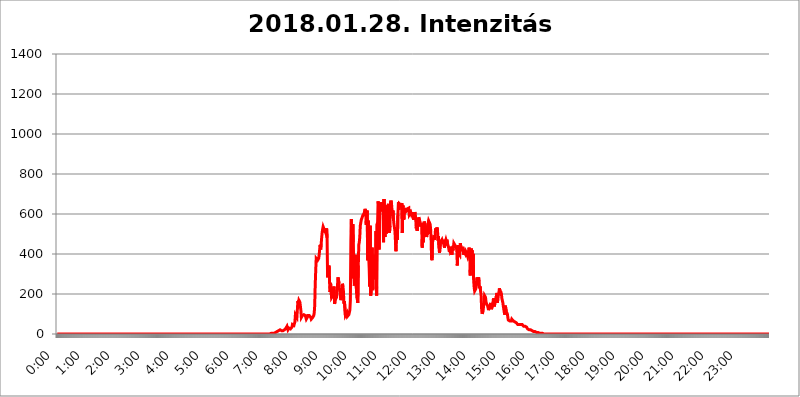
| Category | 2018.01.28. Intenzitás [W/m^2] |
|---|---|
| 0.0 | 0 |
| 0.0006944444444444445 | 0 |
| 0.001388888888888889 | 0 |
| 0.0020833333333333333 | 0 |
| 0.002777777777777778 | 0 |
| 0.003472222222222222 | 0 |
| 0.004166666666666667 | 0 |
| 0.004861111111111111 | 0 |
| 0.005555555555555556 | 0 |
| 0.0062499999999999995 | 0 |
| 0.006944444444444444 | 0 |
| 0.007638888888888889 | 0 |
| 0.008333333333333333 | 0 |
| 0.009027777777777779 | 0 |
| 0.009722222222222222 | 0 |
| 0.010416666666666666 | 0 |
| 0.011111111111111112 | 0 |
| 0.011805555555555555 | 0 |
| 0.012499999999999999 | 0 |
| 0.013194444444444444 | 0 |
| 0.013888888888888888 | 0 |
| 0.014583333333333332 | 0 |
| 0.015277777777777777 | 0 |
| 0.015972222222222224 | 0 |
| 0.016666666666666666 | 0 |
| 0.017361111111111112 | 0 |
| 0.018055555555555557 | 0 |
| 0.01875 | 0 |
| 0.019444444444444445 | 0 |
| 0.02013888888888889 | 0 |
| 0.020833333333333332 | 0 |
| 0.02152777777777778 | 0 |
| 0.022222222222222223 | 0 |
| 0.02291666666666667 | 0 |
| 0.02361111111111111 | 0 |
| 0.024305555555555556 | 0 |
| 0.024999999999999998 | 0 |
| 0.025694444444444447 | 0 |
| 0.02638888888888889 | 0 |
| 0.027083333333333334 | 0 |
| 0.027777777777777776 | 0 |
| 0.02847222222222222 | 0 |
| 0.029166666666666664 | 0 |
| 0.029861111111111113 | 0 |
| 0.030555555555555555 | 0 |
| 0.03125 | 0 |
| 0.03194444444444445 | 0 |
| 0.03263888888888889 | 0 |
| 0.03333333333333333 | 0 |
| 0.034027777777777775 | 0 |
| 0.034722222222222224 | 0 |
| 0.035416666666666666 | 0 |
| 0.036111111111111115 | 0 |
| 0.03680555555555556 | 0 |
| 0.0375 | 0 |
| 0.03819444444444444 | 0 |
| 0.03888888888888889 | 0 |
| 0.03958333333333333 | 0 |
| 0.04027777777777778 | 0 |
| 0.04097222222222222 | 0 |
| 0.041666666666666664 | 0 |
| 0.042361111111111106 | 0 |
| 0.04305555555555556 | 0 |
| 0.043750000000000004 | 0 |
| 0.044444444444444446 | 0 |
| 0.04513888888888889 | 0 |
| 0.04583333333333334 | 0 |
| 0.04652777777777778 | 0 |
| 0.04722222222222222 | 0 |
| 0.04791666666666666 | 0 |
| 0.04861111111111111 | 0 |
| 0.049305555555555554 | 0 |
| 0.049999999999999996 | 0 |
| 0.05069444444444445 | 0 |
| 0.051388888888888894 | 0 |
| 0.052083333333333336 | 0 |
| 0.05277777777777778 | 0 |
| 0.05347222222222222 | 0 |
| 0.05416666666666667 | 0 |
| 0.05486111111111111 | 0 |
| 0.05555555555555555 | 0 |
| 0.05625 | 0 |
| 0.05694444444444444 | 0 |
| 0.057638888888888885 | 0 |
| 0.05833333333333333 | 0 |
| 0.05902777777777778 | 0 |
| 0.059722222222222225 | 0 |
| 0.06041666666666667 | 0 |
| 0.061111111111111116 | 0 |
| 0.06180555555555556 | 0 |
| 0.0625 | 0 |
| 0.06319444444444444 | 0 |
| 0.06388888888888888 | 0 |
| 0.06458333333333334 | 0 |
| 0.06527777777777778 | 0 |
| 0.06597222222222222 | 0 |
| 0.06666666666666667 | 0 |
| 0.06736111111111111 | 0 |
| 0.06805555555555555 | 0 |
| 0.06874999999999999 | 0 |
| 0.06944444444444443 | 0 |
| 0.07013888888888889 | 0 |
| 0.07083333333333333 | 0 |
| 0.07152777777777779 | 0 |
| 0.07222222222222223 | 0 |
| 0.07291666666666667 | 0 |
| 0.07361111111111111 | 0 |
| 0.07430555555555556 | 0 |
| 0.075 | 0 |
| 0.07569444444444444 | 0 |
| 0.0763888888888889 | 0 |
| 0.07708333333333334 | 0 |
| 0.07777777777777778 | 0 |
| 0.07847222222222222 | 0 |
| 0.07916666666666666 | 0 |
| 0.0798611111111111 | 0 |
| 0.08055555555555556 | 0 |
| 0.08125 | 0 |
| 0.08194444444444444 | 0 |
| 0.08263888888888889 | 0 |
| 0.08333333333333333 | 0 |
| 0.08402777777777777 | 0 |
| 0.08472222222222221 | 0 |
| 0.08541666666666665 | 0 |
| 0.08611111111111112 | 0 |
| 0.08680555555555557 | 0 |
| 0.08750000000000001 | 0 |
| 0.08819444444444445 | 0 |
| 0.08888888888888889 | 0 |
| 0.08958333333333333 | 0 |
| 0.09027777777777778 | 0 |
| 0.09097222222222222 | 0 |
| 0.09166666666666667 | 0 |
| 0.09236111111111112 | 0 |
| 0.09305555555555556 | 0 |
| 0.09375 | 0 |
| 0.09444444444444444 | 0 |
| 0.09513888888888888 | 0 |
| 0.09583333333333333 | 0 |
| 0.09652777777777777 | 0 |
| 0.09722222222222222 | 0 |
| 0.09791666666666667 | 0 |
| 0.09861111111111111 | 0 |
| 0.09930555555555555 | 0 |
| 0.09999999999999999 | 0 |
| 0.10069444444444443 | 0 |
| 0.1013888888888889 | 0 |
| 0.10208333333333335 | 0 |
| 0.10277777777777779 | 0 |
| 0.10347222222222223 | 0 |
| 0.10416666666666667 | 0 |
| 0.10486111111111111 | 0 |
| 0.10555555555555556 | 0 |
| 0.10625 | 0 |
| 0.10694444444444444 | 0 |
| 0.1076388888888889 | 0 |
| 0.10833333333333334 | 0 |
| 0.10902777777777778 | 0 |
| 0.10972222222222222 | 0 |
| 0.1111111111111111 | 0 |
| 0.11180555555555556 | 0 |
| 0.11180555555555556 | 0 |
| 0.1125 | 0 |
| 0.11319444444444444 | 0 |
| 0.11388888888888889 | 0 |
| 0.11458333333333333 | 0 |
| 0.11527777777777777 | 0 |
| 0.11597222222222221 | 0 |
| 0.11666666666666665 | 0 |
| 0.1173611111111111 | 0 |
| 0.11805555555555557 | 0 |
| 0.11944444444444445 | 0 |
| 0.12013888888888889 | 0 |
| 0.12083333333333333 | 0 |
| 0.12152777777777778 | 0 |
| 0.12222222222222223 | 0 |
| 0.12291666666666667 | 0 |
| 0.12291666666666667 | 0 |
| 0.12361111111111112 | 0 |
| 0.12430555555555556 | 0 |
| 0.125 | 0 |
| 0.12569444444444444 | 0 |
| 0.12638888888888888 | 0 |
| 0.12708333333333333 | 0 |
| 0.16875 | 0 |
| 0.12847222222222224 | 0 |
| 0.12916666666666668 | 0 |
| 0.12986111111111112 | 0 |
| 0.13055555555555556 | 0 |
| 0.13125 | 0 |
| 0.13194444444444445 | 0 |
| 0.1326388888888889 | 0 |
| 0.13333333333333333 | 0 |
| 0.13402777777777777 | 0 |
| 0.13402777777777777 | 0 |
| 0.13472222222222222 | 0 |
| 0.13541666666666666 | 0 |
| 0.1361111111111111 | 0 |
| 0.13749999999999998 | 0 |
| 0.13819444444444443 | 0 |
| 0.1388888888888889 | 0 |
| 0.13958333333333334 | 0 |
| 0.14027777777777778 | 0 |
| 0.14097222222222222 | 0 |
| 0.14166666666666666 | 0 |
| 0.1423611111111111 | 0 |
| 0.14305555555555557 | 0 |
| 0.14375000000000002 | 0 |
| 0.14444444444444446 | 0 |
| 0.1451388888888889 | 0 |
| 0.1451388888888889 | 0 |
| 0.14652777777777778 | 0 |
| 0.14722222222222223 | 0 |
| 0.14791666666666667 | 0 |
| 0.1486111111111111 | 0 |
| 0.14930555555555555 | 0 |
| 0.15 | 0 |
| 0.15069444444444444 | 0 |
| 0.15138888888888888 | 0 |
| 0.15208333333333332 | 0 |
| 0.15277777777777776 | 0 |
| 0.15347222222222223 | 0 |
| 0.15416666666666667 | 0 |
| 0.15486111111111112 | 0 |
| 0.15555555555555556 | 0 |
| 0.15625 | 0 |
| 0.15694444444444444 | 0 |
| 0.15763888888888888 | 0 |
| 0.15833333333333333 | 0 |
| 0.15902777777777777 | 0 |
| 0.15972222222222224 | 0 |
| 0.16041666666666668 | 0 |
| 0.16111111111111112 | 0 |
| 0.16180555555555556 | 0 |
| 0.1625 | 0 |
| 0.16319444444444445 | 0 |
| 0.1638888888888889 | 0 |
| 0.16458333333333333 | 0 |
| 0.16527777777777777 | 0 |
| 0.16597222222222222 | 0 |
| 0.16666666666666666 | 0 |
| 0.1673611111111111 | 0 |
| 0.16805555555555554 | 0 |
| 0.16874999999999998 | 0 |
| 0.16944444444444443 | 0 |
| 0.17013888888888887 | 0 |
| 0.1708333333333333 | 0 |
| 0.17152777777777775 | 0 |
| 0.17222222222222225 | 0 |
| 0.1729166666666667 | 0 |
| 0.17361111111111113 | 0 |
| 0.17430555555555557 | 0 |
| 0.17500000000000002 | 0 |
| 0.17569444444444446 | 0 |
| 0.1763888888888889 | 0 |
| 0.17708333333333334 | 0 |
| 0.17777777777777778 | 0 |
| 0.17847222222222223 | 0 |
| 0.17916666666666667 | 0 |
| 0.1798611111111111 | 0 |
| 0.18055555555555555 | 0 |
| 0.18125 | 0 |
| 0.18194444444444444 | 0 |
| 0.1826388888888889 | 0 |
| 0.18333333333333335 | 0 |
| 0.1840277777777778 | 0 |
| 0.18472222222222223 | 0 |
| 0.18541666666666667 | 0 |
| 0.18611111111111112 | 0 |
| 0.18680555555555556 | 0 |
| 0.1875 | 0 |
| 0.18819444444444444 | 0 |
| 0.18888888888888888 | 0 |
| 0.18958333333333333 | 0 |
| 0.19027777777777777 | 0 |
| 0.1909722222222222 | 0 |
| 0.19166666666666665 | 0 |
| 0.19236111111111112 | 0 |
| 0.19305555555555554 | 0 |
| 0.19375 | 0 |
| 0.19444444444444445 | 0 |
| 0.1951388888888889 | 0 |
| 0.19583333333333333 | 0 |
| 0.19652777777777777 | 0 |
| 0.19722222222222222 | 0 |
| 0.19791666666666666 | 0 |
| 0.1986111111111111 | 0 |
| 0.19930555555555554 | 0 |
| 0.19999999999999998 | 0 |
| 0.20069444444444443 | 0 |
| 0.20138888888888887 | 0 |
| 0.2020833333333333 | 0 |
| 0.2027777777777778 | 0 |
| 0.2034722222222222 | 0 |
| 0.2041666666666667 | 0 |
| 0.20486111111111113 | 0 |
| 0.20555555555555557 | 0 |
| 0.20625000000000002 | 0 |
| 0.20694444444444446 | 0 |
| 0.2076388888888889 | 0 |
| 0.20833333333333334 | 0 |
| 0.20902777777777778 | 0 |
| 0.20972222222222223 | 0 |
| 0.21041666666666667 | 0 |
| 0.2111111111111111 | 0 |
| 0.21180555555555555 | 0 |
| 0.2125 | 0 |
| 0.21319444444444444 | 0 |
| 0.2138888888888889 | 0 |
| 0.21458333333333335 | 0 |
| 0.2152777777777778 | 0 |
| 0.21597222222222223 | 0 |
| 0.21666666666666667 | 0 |
| 0.21736111111111112 | 0 |
| 0.21805555555555556 | 0 |
| 0.21875 | 0 |
| 0.21944444444444444 | 0 |
| 0.22013888888888888 | 0 |
| 0.22083333333333333 | 0 |
| 0.22152777777777777 | 0 |
| 0.2222222222222222 | 0 |
| 0.22291666666666665 | 0 |
| 0.2236111111111111 | 0 |
| 0.22430555555555556 | 0 |
| 0.225 | 0 |
| 0.22569444444444445 | 0 |
| 0.2263888888888889 | 0 |
| 0.22708333333333333 | 0 |
| 0.22777777777777777 | 0 |
| 0.22847222222222222 | 0 |
| 0.22916666666666666 | 0 |
| 0.2298611111111111 | 0 |
| 0.23055555555555554 | 0 |
| 0.23124999999999998 | 0 |
| 0.23194444444444443 | 0 |
| 0.23263888888888887 | 0 |
| 0.2333333333333333 | 0 |
| 0.2340277777777778 | 0 |
| 0.2347222222222222 | 0 |
| 0.2354166666666667 | 0 |
| 0.23611111111111113 | 0 |
| 0.23680555555555557 | 0 |
| 0.23750000000000002 | 0 |
| 0.23819444444444446 | 0 |
| 0.2388888888888889 | 0 |
| 0.23958333333333334 | 0 |
| 0.24027777777777778 | 0 |
| 0.24097222222222223 | 0 |
| 0.24166666666666667 | 0 |
| 0.2423611111111111 | 0 |
| 0.24305555555555555 | 0 |
| 0.24375 | 0 |
| 0.24444444444444446 | 0 |
| 0.24513888888888888 | 0 |
| 0.24583333333333335 | 0 |
| 0.2465277777777778 | 0 |
| 0.24722222222222223 | 0 |
| 0.24791666666666667 | 0 |
| 0.24861111111111112 | 0 |
| 0.24930555555555556 | 0 |
| 0.25 | 0 |
| 0.25069444444444444 | 0 |
| 0.2513888888888889 | 0 |
| 0.2520833333333333 | 0 |
| 0.25277777777777777 | 0 |
| 0.2534722222222222 | 0 |
| 0.25416666666666665 | 0 |
| 0.2548611111111111 | 0 |
| 0.2555555555555556 | 0 |
| 0.25625000000000003 | 0 |
| 0.2569444444444445 | 0 |
| 0.2576388888888889 | 0 |
| 0.25833333333333336 | 0 |
| 0.2590277777777778 | 0 |
| 0.25972222222222224 | 0 |
| 0.2604166666666667 | 0 |
| 0.2611111111111111 | 0 |
| 0.26180555555555557 | 0 |
| 0.2625 | 0 |
| 0.26319444444444445 | 0 |
| 0.2638888888888889 | 0 |
| 0.26458333333333334 | 0 |
| 0.2652777777777778 | 0 |
| 0.2659722222222222 | 0 |
| 0.26666666666666666 | 0 |
| 0.2673611111111111 | 0 |
| 0.26805555555555555 | 0 |
| 0.26875 | 0 |
| 0.26944444444444443 | 0 |
| 0.2701388888888889 | 0 |
| 0.2708333333333333 | 0 |
| 0.27152777777777776 | 0 |
| 0.2722222222222222 | 0 |
| 0.27291666666666664 | 0 |
| 0.2736111111111111 | 0 |
| 0.2743055555555555 | 0 |
| 0.27499999999999997 | 0 |
| 0.27569444444444446 | 0 |
| 0.27638888888888885 | 0 |
| 0.27708333333333335 | 0 |
| 0.2777777777777778 | 0 |
| 0.27847222222222223 | 0 |
| 0.2791666666666667 | 0 |
| 0.2798611111111111 | 0 |
| 0.28055555555555556 | 0 |
| 0.28125 | 0 |
| 0.28194444444444444 | 0 |
| 0.2826388888888889 | 0 |
| 0.2833333333333333 | 0 |
| 0.28402777777777777 | 0 |
| 0.2847222222222222 | 0 |
| 0.28541666666666665 | 0 |
| 0.28611111111111115 | 0 |
| 0.28680555555555554 | 0 |
| 0.28750000000000003 | 0 |
| 0.2881944444444445 | 0 |
| 0.2888888888888889 | 0 |
| 0.28958333333333336 | 0 |
| 0.2902777777777778 | 0 |
| 0.29097222222222224 | 0 |
| 0.2916666666666667 | 0 |
| 0.2923611111111111 | 0 |
| 0.29305555555555557 | 0 |
| 0.29375 | 0 |
| 0.29444444444444445 | 0 |
| 0.2951388888888889 | 0 |
| 0.29583333333333334 | 0 |
| 0.2965277777777778 | 0 |
| 0.2972222222222222 | 0 |
| 0.29791666666666666 | 0 |
| 0.2986111111111111 | 0 |
| 0.29930555555555555 | 3.525 |
| 0.3 | 3.525 |
| 0.30069444444444443 | 3.525 |
| 0.3013888888888889 | 3.525 |
| 0.3020833333333333 | 3.525 |
| 0.30277777777777776 | 3.525 |
| 0.3034722222222222 | 3.525 |
| 0.30416666666666664 | 3.525 |
| 0.3048611111111111 | 7.887 |
| 0.3055555555555555 | 7.887 |
| 0.30624999999999997 | 7.887 |
| 0.3069444444444444 | 12.257 |
| 0.3076388888888889 | 12.257 |
| 0.30833333333333335 | 12.257 |
| 0.3090277777777778 | 12.257 |
| 0.30972222222222223 | 16.636 |
| 0.3104166666666667 | 16.636 |
| 0.3111111111111111 | 16.636 |
| 0.31180555555555556 | 21.024 |
| 0.3125 | 21.024 |
| 0.31319444444444444 | 21.024 |
| 0.3138888888888889 | 21.024 |
| 0.3145833333333333 | 16.636 |
| 0.31527777777777777 | 16.636 |
| 0.3159722222222222 | 16.636 |
| 0.31666666666666665 | 16.636 |
| 0.31736111111111115 | 21.024 |
| 0.31805555555555554 | 21.024 |
| 0.31875000000000003 | 21.024 |
| 0.3194444444444445 | 21.024 |
| 0.3201388888888889 | 21.024 |
| 0.32083333333333336 | 29.823 |
| 0.3215277777777778 | 34.234 |
| 0.32222222222222224 | 38.653 |
| 0.3229166666666667 | 29.823 |
| 0.3236111111111111 | 21.024 |
| 0.32430555555555557 | 21.024 |
| 0.325 | 29.823 |
| 0.32569444444444445 | 29.823 |
| 0.3263888888888889 | 25.419 |
| 0.32708333333333334 | 25.419 |
| 0.3277777777777778 | 25.419 |
| 0.3284722222222222 | 29.823 |
| 0.32916666666666666 | 34.234 |
| 0.3298611111111111 | 47.511 |
| 0.33055555555555555 | 47.511 |
| 0.33125 | 43.079 |
| 0.33194444444444443 | 43.079 |
| 0.3326388888888889 | 47.511 |
| 0.3333333333333333 | 60.85 |
| 0.3340277777777778 | 96.682 |
| 0.3347222222222222 | 101.184 |
| 0.3354166666666667 | 96.682 |
| 0.3361111111111111 | 83.205 |
| 0.3368055555555556 | 123.758 |
| 0.33749999999999997 | 164.605 |
| 0.33819444444444446 | 155.509 |
| 0.33888888888888885 | 169.156 |
| 0.33958333333333335 | 173.709 |
| 0.34027777777777773 | 160.056 |
| 0.34097222222222223 | 160.056 |
| 0.3416666666666666 | 119.235 |
| 0.3423611111111111 | 83.205 |
| 0.3430555555555555 | 83.205 |
| 0.34375 | 92.184 |
| 0.3444444444444445 | 96.682 |
| 0.3451388888888889 | 96.682 |
| 0.3458333333333334 | 96.682 |
| 0.34652777777777777 | 101.184 |
| 0.34722222222222227 | 101.184 |
| 0.34791666666666665 | 92.184 |
| 0.34861111111111115 | 83.205 |
| 0.34930555555555554 | 74.246 |
| 0.35000000000000003 | 78.722 |
| 0.3506944444444444 | 83.205 |
| 0.3513888888888889 | 92.184 |
| 0.3520833333333333 | 92.184 |
| 0.3527777777777778 | 92.184 |
| 0.3534722222222222 | 92.184 |
| 0.3541666666666667 | 92.184 |
| 0.3548611111111111 | 87.692 |
| 0.35555555555555557 | 83.205 |
| 0.35625 | 74.246 |
| 0.35694444444444445 | 78.722 |
| 0.3576388888888889 | 78.722 |
| 0.35833333333333334 | 83.205 |
| 0.3590277777777778 | 83.205 |
| 0.3597222222222222 | 92.184 |
| 0.36041666666666666 | 105.69 |
| 0.3611111111111111 | 141.884 |
| 0.36180555555555555 | 246.689 |
| 0.3625 | 314.98 |
| 0.36319444444444443 | 378.224 |
| 0.3638888888888889 | 382.715 |
| 0.3645833333333333 | 382.715 |
| 0.3652777777777778 | 369.23 |
| 0.3659722222222222 | 364.728 |
| 0.3666666666666667 | 378.224 |
| 0.3673611111111111 | 396.164 |
| 0.3680555555555556 | 422.943 |
| 0.36874999999999997 | 445.129 |
| 0.36944444444444446 | 422.943 |
| 0.37013888888888885 | 449.551 |
| 0.37083333333333335 | 480.356 |
| 0.37152777777777773 | 506.542 |
| 0.37222222222222223 | 523.88 |
| 0.3729166666666666 | 536.82 |
| 0.3736111111111111 | 532.513 |
| 0.3743055555555555 | 523.88 |
| 0.375 | 523.88 |
| 0.3756944444444445 | 523.88 |
| 0.3763888888888889 | 506.542 |
| 0.3770833333333334 | 519.555 |
| 0.37777777777777777 | 528.2 |
| 0.37847222222222227 | 480.356 |
| 0.37916666666666665 | 283.156 |
| 0.37986111111111115 | 310.44 |
| 0.38055555555555554 | 314.98 |
| 0.38125000000000003 | 342.162 |
| 0.3819444444444444 | 255.813 |
| 0.3826388888888889 | 210.182 |
| 0.3833333333333333 | 255.813 |
| 0.3840277777777778 | 251.251 |
| 0.3847222222222222 | 182.82 |
| 0.3854166666666667 | 182.82 |
| 0.3861111111111111 | 187.378 |
| 0.38680555555555557 | 196.497 |
| 0.3875 | 219.309 |
| 0.38819444444444445 | 237.564 |
| 0.3888888888888889 | 150.964 |
| 0.38958333333333334 | 160.056 |
| 0.3902777777777778 | 173.709 |
| 0.3909722222222222 | 178.264 |
| 0.39166666666666666 | 182.82 |
| 0.3923611111111111 | 219.309 |
| 0.39305555555555555 | 242.127 |
| 0.39375 | 283.156 |
| 0.39444444444444443 | 278.603 |
| 0.3951388888888889 | 255.813 |
| 0.3958333333333333 | 223.873 |
| 0.3965277777777778 | 210.182 |
| 0.3972222222222222 | 182.82 |
| 0.3979166666666667 | 169.156 |
| 0.3986111111111111 | 169.156 |
| 0.3993055555555556 | 196.497 |
| 0.39999999999999997 | 251.251 |
| 0.40069444444444446 | 237.564 |
| 0.40138888888888885 | 214.746 |
| 0.40208333333333335 | 150.964 |
| 0.40277777777777773 | 164.605 |
| 0.40347222222222223 | 160.056 |
| 0.4041666666666666 | 92.184 |
| 0.4048611111111111 | 87.692 |
| 0.4055555555555555 | 92.184 |
| 0.40625 | 105.69 |
| 0.4069444444444445 | 87.692 |
| 0.4076388888888889 | 87.692 |
| 0.4083333333333334 | 92.184 |
| 0.40902777777777777 | 96.682 |
| 0.40972222222222227 | 101.184 |
| 0.41041666666666665 | 119.235 |
| 0.41111111111111115 | 169.156 |
| 0.41180555555555554 | 467.187 |
| 0.41250000000000003 | 575.299 |
| 0.4131944444444444 | 278.603 |
| 0.4138888888888889 | 480.356 |
| 0.4145833333333333 | 549.704 |
| 0.4152777777777778 | 458.38 |
| 0.4159722222222222 | 305.898 |
| 0.4166666666666667 | 242.127 |
| 0.4173611111111111 | 260.373 |
| 0.41805555555555557 | 396.164 |
| 0.41875 | 396.164 |
| 0.41944444444444445 | 233 |
| 0.4201388888888889 | 182.82 |
| 0.42083333333333334 | 173.709 |
| 0.4215277777777778 | 155.509 |
| 0.4222222222222222 | 342.162 |
| 0.42291666666666666 | 445.129 |
| 0.4236111111111111 | 458.38 |
| 0.42430555555555555 | 484.735 |
| 0.425 | 541.121 |
| 0.42569444444444443 | 541.121 |
| 0.4263888888888889 | 571.049 |
| 0.4270833333333333 | 575.299 |
| 0.4277777777777778 | 583.779 |
| 0.4284722222222222 | 592.233 |
| 0.4291666666666667 | 588.009 |
| 0.4298611111111111 | 600.661 |
| 0.4305555555555556 | 592.233 |
| 0.43124999999999997 | 617.436 |
| 0.43194444444444446 | 625.784 |
| 0.43263888888888885 | 604.864 |
| 0.43333333333333335 | 545.416 |
| 0.43402777777777773 | 600.661 |
| 0.43472222222222223 | 617.436 |
| 0.4354166666666666 | 369.23 |
| 0.4361111111111111 | 566.793 |
| 0.4368055555555555 | 387.202 |
| 0.4375 | 328.584 |
| 0.4381944444444445 | 237.564 |
| 0.4388888888888889 | 541.121 |
| 0.4395833333333334 | 191.937 |
| 0.44027777777777777 | 219.309 |
| 0.44097222222222227 | 355.712 |
| 0.44166666666666665 | 431.833 |
| 0.44236111111111115 | 219.309 |
| 0.44305555555555554 | 233 |
| 0.44375000000000003 | 378.224 |
| 0.4444444444444444 | 274.047 |
| 0.4451388888888889 | 396.164 |
| 0.4458333333333333 | 387.202 |
| 0.4465277777777778 | 292.259 |
| 0.4472222222222222 | 515.223 |
| 0.4479166666666667 | 191.937 |
| 0.4486111111111111 | 549.704 |
| 0.44930555555555557 | 558.261 |
| 0.45 | 663.019 |
| 0.45069444444444445 | 646.537 |
| 0.4513888888888889 | 422.943 |
| 0.45208333333333334 | 588.009 |
| 0.4527777777777778 | 658.909 |
| 0.4534722222222222 | 634.105 |
| 0.45416666666666666 | 629.948 |
| 0.4548611111111111 | 613.252 |
| 0.45555555555555555 | 638.256 |
| 0.45625 | 658.909 |
| 0.45694444444444443 | 613.252 |
| 0.4576388888888889 | 458.38 |
| 0.4583333333333333 | 675.311 |
| 0.4590277777777778 | 583.779 |
| 0.4597222222222222 | 484.735 |
| 0.4604166666666667 | 642.4 |
| 0.4611111111111111 | 613.252 |
| 0.4618055555555556 | 502.192 |
| 0.46249999999999997 | 571.049 |
| 0.46319444444444446 | 638.256 |
| 0.46388888888888885 | 638.256 |
| 0.46458333333333335 | 650.667 |
| 0.46527777777777773 | 566.793 |
| 0.46597222222222223 | 506.542 |
| 0.4666666666666666 | 541.121 |
| 0.4673611111111111 | 658.909 |
| 0.4680555555555555 | 667.123 |
| 0.46875 | 654.791 |
| 0.4694444444444445 | 658.909 |
| 0.4701388888888889 | 592.233 |
| 0.4708333333333334 | 617.436 |
| 0.47152777777777777 | 575.299 |
| 0.47222222222222227 | 549.704 |
| 0.47291666666666665 | 549.704 |
| 0.47361111111111115 | 515.223 |
| 0.47430555555555554 | 467.187 |
| 0.47500000000000003 | 414.035 |
| 0.4756944444444444 | 506.542 |
| 0.4763888888888889 | 502.192 |
| 0.4770833333333333 | 471.582 |
| 0.4777777777777778 | 596.45 |
| 0.4784722222222222 | 658.909 |
| 0.4791666666666667 | 621.613 |
| 0.4798611111111111 | 650.667 |
| 0.48055555555555557 | 654.791 |
| 0.48125 | 650.667 |
| 0.48194444444444445 | 642.4 |
| 0.4826388888888889 | 646.537 |
| 0.48333333333333334 | 654.791 |
| 0.4840277777777778 | 506.542 |
| 0.4847222222222222 | 642.4 |
| 0.48541666666666666 | 634.105 |
| 0.4861111111111111 | 571.049 |
| 0.48680555555555555 | 629.948 |
| 0.4875 | 621.613 |
| 0.48819444444444443 | 609.062 |
| 0.4888888888888889 | 604.864 |
| 0.4895833333333333 | 613.252 |
| 0.4902777777777778 | 617.436 |
| 0.4909722222222222 | 625.784 |
| 0.4916666666666667 | 621.613 |
| 0.4923611111111111 | 621.613 |
| 0.4930555555555556 | 629.948 |
| 0.49374999999999997 | 596.45 |
| 0.49444444444444446 | 596.45 |
| 0.49513888888888885 | 600.661 |
| 0.49583333333333335 | 609.062 |
| 0.49652777777777773 | 600.661 |
| 0.49722222222222223 | 609.062 |
| 0.4979166666666666 | 596.45 |
| 0.4986111111111111 | 609.062 |
| 0.4993055555555555 | 609.062 |
| 0.5 | 571.049 |
| 0.5006944444444444 | 571.049 |
| 0.5013888888888889 | 609.062 |
| 0.5020833333333333 | 600.661 |
| 0.5027777777777778 | 575.299 |
| 0.5034722222222222 | 528.2 |
| 0.5041666666666667 | 545.416 |
| 0.5048611111111111 | 515.223 |
| 0.5055555555555555 | 545.416 |
| 0.50625 | 558.261 |
| 0.5069444444444444 | 583.779 |
| 0.5076388888888889 | 579.542 |
| 0.5083333333333333 | 566.793 |
| 0.5090277777777777 | 558.261 |
| 0.5097222222222222 | 536.82 |
| 0.5104166666666666 | 553.986 |
| 0.5111111111111112 | 545.416 |
| 0.5118055555555555 | 431.833 |
| 0.5125000000000001 | 528.2 |
| 0.5131944444444444 | 458.38 |
| 0.513888888888889 | 523.88 |
| 0.5145833333333333 | 562.53 |
| 0.5152777777777778 | 558.261 |
| 0.5159722222222222 | 558.261 |
| 0.5166666666666667 | 532.513 |
| 0.517361111111111 | 536.82 |
| 0.5180555555555556 | 484.735 |
| 0.5187499999999999 | 506.542 |
| 0.5194444444444445 | 497.836 |
| 0.5201388888888888 | 553.986 |
| 0.5208333333333334 | 566.793 |
| 0.5215277777777778 | 566.793 |
| 0.5222222222222223 | 562.53 |
| 0.5229166666666667 | 549.704 |
| 0.5236111111111111 | 528.2 |
| 0.5243055555555556 | 480.356 |
| 0.525 | 378.224 |
| 0.5256944444444445 | 369.23 |
| 0.5263888888888889 | 458.38 |
| 0.5270833333333333 | 471.582 |
| 0.5277777777777778 | 480.356 |
| 0.5284722222222222 | 493.475 |
| 0.5291666666666667 | 471.582 |
| 0.5298611111111111 | 484.735 |
| 0.5305555555555556 | 528.2 |
| 0.53125 | 528.2 |
| 0.5319444444444444 | 515.223 |
| 0.5326388888888889 | 532.513 |
| 0.5333333333333333 | 519.555 |
| 0.5340277777777778 | 467.187 |
| 0.5347222222222222 | 489.108 |
| 0.5354166666666667 | 431.833 |
| 0.5361111111111111 | 405.108 |
| 0.5368055555555555 | 400.638 |
| 0.5375 | 458.38 |
| 0.5381944444444444 | 453.968 |
| 0.5388888888888889 | 458.38 |
| 0.5395833333333333 | 471.582 |
| 0.5402777777777777 | 462.786 |
| 0.5409722222222222 | 458.38 |
| 0.5416666666666666 | 453.968 |
| 0.5423611111111112 | 471.582 |
| 0.5430555555555555 | 431.833 |
| 0.5437500000000001 | 453.968 |
| 0.5444444444444444 | 453.968 |
| 0.545138888888889 | 471.582 |
| 0.5458333333333333 | 462.786 |
| 0.5465277777777778 | 471.582 |
| 0.5472222222222222 | 453.968 |
| 0.5479166666666667 | 449.551 |
| 0.548611111111111 | 436.27 |
| 0.5493055555555556 | 436.27 |
| 0.5499999999999999 | 409.574 |
| 0.5506944444444445 | 436.27 |
| 0.5513888888888888 | 414.035 |
| 0.5520833333333334 | 414.035 |
| 0.5527777777777778 | 422.943 |
| 0.5534722222222223 | 396.164 |
| 0.5541666666666667 | 431.833 |
| 0.5548611111111111 | 418.492 |
| 0.5555555555555556 | 427.39 |
| 0.55625 | 453.968 |
| 0.5569444444444445 | 449.551 |
| 0.5576388888888889 | 458.38 |
| 0.5583333333333333 | 440.702 |
| 0.5590277777777778 | 445.129 |
| 0.5597222222222222 | 431.833 |
| 0.5604166666666667 | 418.492 |
| 0.5611111111111111 | 342.162 |
| 0.5618055555555556 | 409.574 |
| 0.5625 | 445.129 |
| 0.5631944444444444 | 405.108 |
| 0.5638888888888889 | 405.108 |
| 0.5645833333333333 | 396.164 |
| 0.5652777777777778 | 453.968 |
| 0.5659722222222222 | 440.702 |
| 0.5666666666666667 | 436.27 |
| 0.5673611111111111 | 414.035 |
| 0.5680555555555555 | 427.39 |
| 0.56875 | 436.27 |
| 0.5694444444444444 | 414.035 |
| 0.5701388888888889 | 396.164 |
| 0.5708333333333333 | 409.574 |
| 0.5715277777777777 | 409.574 |
| 0.5722222222222222 | 400.638 |
| 0.5729166666666666 | 414.035 |
| 0.5736111111111112 | 414.035 |
| 0.5743055555555555 | 405.108 |
| 0.5750000000000001 | 405.108 |
| 0.5756944444444444 | 387.202 |
| 0.576388888888889 | 396.164 |
| 0.5770833333333333 | 422.943 |
| 0.5777777777777778 | 431.833 |
| 0.5784722222222222 | 409.574 |
| 0.5791666666666667 | 292.259 |
| 0.579861111111111 | 369.23 |
| 0.5805555555555556 | 427.39 |
| 0.5812499999999999 | 409.574 |
| 0.5819444444444445 | 418.492 |
| 0.5826388888888888 | 346.682 |
| 0.5833333333333334 | 400.638 |
| 0.5840277777777778 | 269.49 |
| 0.5847222222222223 | 233 |
| 0.5854166666666667 | 214.746 |
| 0.5861111111111111 | 214.746 |
| 0.5868055555555556 | 223.873 |
| 0.5875 | 233 |
| 0.5881944444444445 | 251.251 |
| 0.5888888888888889 | 283.156 |
| 0.5895833333333333 | 260.373 |
| 0.5902777777777778 | 269.49 |
| 0.5909722222222222 | 283.156 |
| 0.5916666666666667 | 260.373 |
| 0.5923611111111111 | 228.436 |
| 0.5930555555555556 | 237.564 |
| 0.59375 | 214.746 |
| 0.5944444444444444 | 196.497 |
| 0.5951388888888889 | 128.284 |
| 0.5958333333333333 | 101.184 |
| 0.5965277777777778 | 101.184 |
| 0.5972222222222222 | 114.716 |
| 0.5979166666666667 | 137.347 |
| 0.5986111111111111 | 160.056 |
| 0.5993055555555555 | 191.937 |
| 0.6 | 191.937 |
| 0.6006944444444444 | 182.82 |
| 0.6013888888888889 | 160.056 |
| 0.6020833333333333 | 150.964 |
| 0.6027777777777777 | 146.423 |
| 0.6034722222222222 | 141.884 |
| 0.6041666666666666 | 132.814 |
| 0.6048611111111112 | 119.235 |
| 0.6055555555555555 | 119.235 |
| 0.6062500000000001 | 141.884 |
| 0.6069444444444444 | 128.284 |
| 0.607638888888889 | 155.509 |
| 0.6083333333333333 | 132.814 |
| 0.6090277777777778 | 123.758 |
| 0.6097222222222222 | 119.235 |
| 0.6104166666666667 | 119.235 |
| 0.611111111111111 | 155.509 |
| 0.6118055555555556 | 178.264 |
| 0.6124999999999999 | 146.423 |
| 0.6131944444444445 | 137.347 |
| 0.6138888888888888 | 164.605 |
| 0.6145833333333334 | 155.509 |
| 0.6152777777777778 | 155.509 |
| 0.6159722222222223 | 191.937 |
| 0.6166666666666667 | 205.62 |
| 0.6173611111111111 | 155.509 |
| 0.6180555555555556 | 182.82 |
| 0.61875 | 178.264 |
| 0.6194444444444445 | 205.62 |
| 0.6201388888888889 | 228.436 |
| 0.6208333333333333 | 219.309 |
| 0.6215277777777778 | 219.309 |
| 0.6222222222222222 | 210.182 |
| 0.6229166666666667 | 201.058 |
| 0.6236111111111111 | 178.264 |
| 0.6243055555555556 | 182.82 |
| 0.625 | 155.509 |
| 0.6256944444444444 | 137.347 |
| 0.6263888888888889 | 137.347 |
| 0.6270833333333333 | 105.69 |
| 0.6277777777777778 | 96.682 |
| 0.6284722222222222 | 141.884 |
| 0.6291666666666667 | 137.347 |
| 0.6298611111111111 | 110.201 |
| 0.6305555555555555 | 105.69 |
| 0.63125 | 101.184 |
| 0.6319444444444444 | 83.205 |
| 0.6326388888888889 | 69.775 |
| 0.6333333333333333 | 65.31 |
| 0.6340277777777777 | 65.31 |
| 0.6347222222222222 | 65.31 |
| 0.6354166666666666 | 60.85 |
| 0.6361111111111112 | 65.31 |
| 0.6368055555555555 | 65.31 |
| 0.6375000000000001 | 74.246 |
| 0.6381944444444444 | 78.722 |
| 0.638888888888889 | 74.246 |
| 0.6395833333333333 | 65.31 |
| 0.6402777777777778 | 65.31 |
| 0.6409722222222222 | 65.31 |
| 0.6416666666666667 | 60.85 |
| 0.642361111111111 | 60.85 |
| 0.6430555555555556 | 56.398 |
| 0.6437499999999999 | 56.398 |
| 0.6444444444444445 | 51.951 |
| 0.6451388888888888 | 51.951 |
| 0.6458333333333334 | 47.511 |
| 0.6465277777777778 | 47.511 |
| 0.6472222222222223 | 47.511 |
| 0.6479166666666667 | 47.511 |
| 0.6486111111111111 | 47.511 |
| 0.6493055555555556 | 47.511 |
| 0.65 | 47.511 |
| 0.6506944444444445 | 51.951 |
| 0.6513888888888889 | 47.511 |
| 0.6520833333333333 | 47.511 |
| 0.6527777777777778 | 47.511 |
| 0.6534722222222222 | 47.511 |
| 0.6541666666666667 | 38.653 |
| 0.6548611111111111 | 43.079 |
| 0.6555555555555556 | 43.079 |
| 0.65625 | 38.653 |
| 0.6569444444444444 | 38.653 |
| 0.6576388888888889 | 34.234 |
| 0.6583333333333333 | 34.234 |
| 0.6590277777777778 | 29.823 |
| 0.6597222222222222 | 25.419 |
| 0.6604166666666667 | 25.419 |
| 0.6611111111111111 | 25.419 |
| 0.6618055555555555 | 21.024 |
| 0.6625 | 21.024 |
| 0.6631944444444444 | 21.024 |
| 0.6638888888888889 | 21.024 |
| 0.6645833333333333 | 21.024 |
| 0.6652777777777777 | 21.024 |
| 0.6659722222222222 | 16.636 |
| 0.6666666666666666 | 16.636 |
| 0.6673611111111111 | 16.636 |
| 0.6680555555555556 | 12.257 |
| 0.6687500000000001 | 12.257 |
| 0.6694444444444444 | 12.257 |
| 0.6701388888888888 | 12.257 |
| 0.6708333333333334 | 7.887 |
| 0.6715277777777778 | 7.887 |
| 0.6722222222222222 | 7.887 |
| 0.6729166666666666 | 7.887 |
| 0.6736111111111112 | 7.887 |
| 0.6743055555555556 | 7.887 |
| 0.6749999999999999 | 7.887 |
| 0.6756944444444444 | 7.887 |
| 0.6763888888888889 | 3.525 |
| 0.6770833333333334 | 3.525 |
| 0.6777777777777777 | 3.525 |
| 0.6784722222222223 | 3.525 |
| 0.6791666666666667 | 3.525 |
| 0.6798611111111111 | 3.525 |
| 0.6805555555555555 | 3.525 |
| 0.68125 | 0 |
| 0.6819444444444445 | 3.525 |
| 0.6826388888888889 | 0 |
| 0.6833333333333332 | 0 |
| 0.6840277777777778 | 0 |
| 0.6847222222222222 | 0 |
| 0.6854166666666667 | 0 |
| 0.686111111111111 | 0 |
| 0.6868055555555556 | 0 |
| 0.6875 | 0 |
| 0.6881944444444444 | 0 |
| 0.688888888888889 | 0 |
| 0.6895833333333333 | 0 |
| 0.6902777777777778 | 0 |
| 0.6909722222222222 | 0 |
| 0.6916666666666668 | 0 |
| 0.6923611111111111 | 0 |
| 0.6930555555555555 | 0 |
| 0.69375 | 0 |
| 0.6944444444444445 | 0 |
| 0.6951388888888889 | 0 |
| 0.6958333333333333 | 0 |
| 0.6965277777777777 | 0 |
| 0.6972222222222223 | 0 |
| 0.6979166666666666 | 0 |
| 0.6986111111111111 | 0 |
| 0.6993055555555556 | 0 |
| 0.7000000000000001 | 0 |
| 0.7006944444444444 | 0 |
| 0.7013888888888888 | 0 |
| 0.7020833333333334 | 0 |
| 0.7027777777777778 | 0 |
| 0.7034722222222222 | 0 |
| 0.7041666666666666 | 0 |
| 0.7048611111111112 | 0 |
| 0.7055555555555556 | 0 |
| 0.7062499999999999 | 0 |
| 0.7069444444444444 | 0 |
| 0.7076388888888889 | 0 |
| 0.7083333333333334 | 0 |
| 0.7090277777777777 | 0 |
| 0.7097222222222223 | 0 |
| 0.7104166666666667 | 0 |
| 0.7111111111111111 | 0 |
| 0.7118055555555555 | 0 |
| 0.7125 | 0 |
| 0.7131944444444445 | 0 |
| 0.7138888888888889 | 0 |
| 0.7145833333333332 | 0 |
| 0.7152777777777778 | 0 |
| 0.7159722222222222 | 0 |
| 0.7166666666666667 | 0 |
| 0.717361111111111 | 0 |
| 0.7180555555555556 | 0 |
| 0.71875 | 0 |
| 0.7194444444444444 | 0 |
| 0.720138888888889 | 0 |
| 0.7208333333333333 | 0 |
| 0.7215277777777778 | 0 |
| 0.7222222222222222 | 0 |
| 0.7229166666666668 | 0 |
| 0.7236111111111111 | 0 |
| 0.7243055555555555 | 0 |
| 0.725 | 0 |
| 0.7256944444444445 | 0 |
| 0.7263888888888889 | 0 |
| 0.7270833333333333 | 0 |
| 0.7277777777777777 | 0 |
| 0.7284722222222223 | 0 |
| 0.7291666666666666 | 0 |
| 0.7298611111111111 | 0 |
| 0.7305555555555556 | 0 |
| 0.7312500000000001 | 0 |
| 0.7319444444444444 | 0 |
| 0.7326388888888888 | 0 |
| 0.7333333333333334 | 0 |
| 0.7340277777777778 | 0 |
| 0.7347222222222222 | 0 |
| 0.7354166666666666 | 0 |
| 0.7361111111111112 | 0 |
| 0.7368055555555556 | 0 |
| 0.7374999999999999 | 0 |
| 0.7381944444444444 | 0 |
| 0.7388888888888889 | 0 |
| 0.7395833333333334 | 0 |
| 0.7402777777777777 | 0 |
| 0.7409722222222223 | 0 |
| 0.7416666666666667 | 0 |
| 0.7423611111111111 | 0 |
| 0.7430555555555555 | 0 |
| 0.74375 | 0 |
| 0.7444444444444445 | 0 |
| 0.7451388888888889 | 0 |
| 0.7458333333333332 | 0 |
| 0.7465277777777778 | 0 |
| 0.7472222222222222 | 0 |
| 0.7479166666666667 | 0 |
| 0.748611111111111 | 0 |
| 0.7493055555555556 | 0 |
| 0.75 | 0 |
| 0.7506944444444444 | 0 |
| 0.751388888888889 | 0 |
| 0.7520833333333333 | 0 |
| 0.7527777777777778 | 0 |
| 0.7534722222222222 | 0 |
| 0.7541666666666668 | 0 |
| 0.7548611111111111 | 0 |
| 0.7555555555555555 | 0 |
| 0.75625 | 0 |
| 0.7569444444444445 | 0 |
| 0.7576388888888889 | 0 |
| 0.7583333333333333 | 0 |
| 0.7590277777777777 | 0 |
| 0.7597222222222223 | 0 |
| 0.7604166666666666 | 0 |
| 0.7611111111111111 | 0 |
| 0.7618055555555556 | 0 |
| 0.7625000000000001 | 0 |
| 0.7631944444444444 | 0 |
| 0.7638888888888888 | 0 |
| 0.7645833333333334 | 0 |
| 0.7652777777777778 | 0 |
| 0.7659722222222222 | 0 |
| 0.7666666666666666 | 0 |
| 0.7673611111111112 | 0 |
| 0.7680555555555556 | 0 |
| 0.7687499999999999 | 0 |
| 0.7694444444444444 | 0 |
| 0.7701388888888889 | 0 |
| 0.7708333333333334 | 0 |
| 0.7715277777777777 | 0 |
| 0.7722222222222223 | 0 |
| 0.7729166666666667 | 0 |
| 0.7736111111111111 | 0 |
| 0.7743055555555555 | 0 |
| 0.775 | 0 |
| 0.7756944444444445 | 0 |
| 0.7763888888888889 | 0 |
| 0.7770833333333332 | 0 |
| 0.7777777777777778 | 0 |
| 0.7784722222222222 | 0 |
| 0.7791666666666667 | 0 |
| 0.779861111111111 | 0 |
| 0.7805555555555556 | 0 |
| 0.78125 | 0 |
| 0.7819444444444444 | 0 |
| 0.782638888888889 | 0 |
| 0.7833333333333333 | 0 |
| 0.7840277777777778 | 0 |
| 0.7847222222222222 | 0 |
| 0.7854166666666668 | 0 |
| 0.7861111111111111 | 0 |
| 0.7868055555555555 | 0 |
| 0.7875 | 0 |
| 0.7881944444444445 | 0 |
| 0.7888888888888889 | 0 |
| 0.7895833333333333 | 0 |
| 0.7902777777777777 | 0 |
| 0.7909722222222223 | 0 |
| 0.7916666666666666 | 0 |
| 0.7923611111111111 | 0 |
| 0.7930555555555556 | 0 |
| 0.7937500000000001 | 0 |
| 0.7944444444444444 | 0 |
| 0.7951388888888888 | 0 |
| 0.7958333333333334 | 0 |
| 0.7965277777777778 | 0 |
| 0.7972222222222222 | 0 |
| 0.7979166666666666 | 0 |
| 0.7986111111111112 | 0 |
| 0.7993055555555556 | 0 |
| 0.7999999999999999 | 0 |
| 0.8006944444444444 | 0 |
| 0.8013888888888889 | 0 |
| 0.8020833333333334 | 0 |
| 0.8027777777777777 | 0 |
| 0.8034722222222223 | 0 |
| 0.8041666666666667 | 0 |
| 0.8048611111111111 | 0 |
| 0.8055555555555555 | 0 |
| 0.80625 | 0 |
| 0.8069444444444445 | 0 |
| 0.8076388888888889 | 0 |
| 0.8083333333333332 | 0 |
| 0.8090277777777778 | 0 |
| 0.8097222222222222 | 0 |
| 0.8104166666666667 | 0 |
| 0.811111111111111 | 0 |
| 0.8118055555555556 | 0 |
| 0.8125 | 0 |
| 0.8131944444444444 | 0 |
| 0.813888888888889 | 0 |
| 0.8145833333333333 | 0 |
| 0.8152777777777778 | 0 |
| 0.8159722222222222 | 0 |
| 0.8166666666666668 | 0 |
| 0.8173611111111111 | 0 |
| 0.8180555555555555 | 0 |
| 0.81875 | 0 |
| 0.8194444444444445 | 0 |
| 0.8201388888888889 | 0 |
| 0.8208333333333333 | 0 |
| 0.8215277777777777 | 0 |
| 0.8222222222222223 | 0 |
| 0.8229166666666666 | 0 |
| 0.8236111111111111 | 0 |
| 0.8243055555555556 | 0 |
| 0.8250000000000001 | 0 |
| 0.8256944444444444 | 0 |
| 0.8263888888888888 | 0 |
| 0.8270833333333334 | 0 |
| 0.8277777777777778 | 0 |
| 0.8284722222222222 | 0 |
| 0.8291666666666666 | 0 |
| 0.8298611111111112 | 0 |
| 0.8305555555555556 | 0 |
| 0.8312499999999999 | 0 |
| 0.8319444444444444 | 0 |
| 0.8326388888888889 | 0 |
| 0.8333333333333334 | 0 |
| 0.8340277777777777 | 0 |
| 0.8347222222222223 | 0 |
| 0.8354166666666667 | 0 |
| 0.8361111111111111 | 0 |
| 0.8368055555555555 | 0 |
| 0.8375 | 0 |
| 0.8381944444444445 | 0 |
| 0.8388888888888889 | 0 |
| 0.8395833333333332 | 0 |
| 0.8402777777777778 | 0 |
| 0.8409722222222222 | 0 |
| 0.8416666666666667 | 0 |
| 0.842361111111111 | 0 |
| 0.8430555555555556 | 0 |
| 0.84375 | 0 |
| 0.8444444444444444 | 0 |
| 0.845138888888889 | 0 |
| 0.8458333333333333 | 0 |
| 0.8465277777777778 | 0 |
| 0.8472222222222222 | 0 |
| 0.8479166666666668 | 0 |
| 0.8486111111111111 | 0 |
| 0.8493055555555555 | 0 |
| 0.85 | 0 |
| 0.8506944444444445 | 0 |
| 0.8513888888888889 | 0 |
| 0.8520833333333333 | 0 |
| 0.8527777777777777 | 0 |
| 0.8534722222222223 | 0 |
| 0.8541666666666666 | 0 |
| 0.8548611111111111 | 0 |
| 0.8555555555555556 | 0 |
| 0.8562500000000001 | 0 |
| 0.8569444444444444 | 0 |
| 0.8576388888888888 | 0 |
| 0.8583333333333334 | 0 |
| 0.8590277777777778 | 0 |
| 0.8597222222222222 | 0 |
| 0.8604166666666666 | 0 |
| 0.8611111111111112 | 0 |
| 0.8618055555555556 | 0 |
| 0.8624999999999999 | 0 |
| 0.8631944444444444 | 0 |
| 0.8638888888888889 | 0 |
| 0.8645833333333334 | 0 |
| 0.8652777777777777 | 0 |
| 0.8659722222222223 | 0 |
| 0.8666666666666667 | 0 |
| 0.8673611111111111 | 0 |
| 0.8680555555555555 | 0 |
| 0.86875 | 0 |
| 0.8694444444444445 | 0 |
| 0.8701388888888889 | 0 |
| 0.8708333333333332 | 0 |
| 0.8715277777777778 | 0 |
| 0.8722222222222222 | 0 |
| 0.8729166666666667 | 0 |
| 0.873611111111111 | 0 |
| 0.8743055555555556 | 0 |
| 0.875 | 0 |
| 0.8756944444444444 | 0 |
| 0.876388888888889 | 0 |
| 0.8770833333333333 | 0 |
| 0.8777777777777778 | 0 |
| 0.8784722222222222 | 0 |
| 0.8791666666666668 | 0 |
| 0.8798611111111111 | 0 |
| 0.8805555555555555 | 0 |
| 0.88125 | 0 |
| 0.8819444444444445 | 0 |
| 0.8826388888888889 | 0 |
| 0.8833333333333333 | 0 |
| 0.8840277777777777 | 0 |
| 0.8847222222222223 | 0 |
| 0.8854166666666666 | 0 |
| 0.8861111111111111 | 0 |
| 0.8868055555555556 | 0 |
| 0.8875000000000001 | 0 |
| 0.8881944444444444 | 0 |
| 0.8888888888888888 | 0 |
| 0.8895833333333334 | 0 |
| 0.8902777777777778 | 0 |
| 0.8909722222222222 | 0 |
| 0.8916666666666666 | 0 |
| 0.8923611111111112 | 0 |
| 0.8930555555555556 | 0 |
| 0.8937499999999999 | 0 |
| 0.8944444444444444 | 0 |
| 0.8951388888888889 | 0 |
| 0.8958333333333334 | 0 |
| 0.8965277777777777 | 0 |
| 0.8972222222222223 | 0 |
| 0.8979166666666667 | 0 |
| 0.8986111111111111 | 0 |
| 0.8993055555555555 | 0 |
| 0.9 | 0 |
| 0.9006944444444445 | 0 |
| 0.9013888888888889 | 0 |
| 0.9020833333333332 | 0 |
| 0.9027777777777778 | 0 |
| 0.9034722222222222 | 0 |
| 0.9041666666666667 | 0 |
| 0.904861111111111 | 0 |
| 0.9055555555555556 | 0 |
| 0.90625 | 0 |
| 0.9069444444444444 | 0 |
| 0.907638888888889 | 0 |
| 0.9083333333333333 | 0 |
| 0.9090277777777778 | 0 |
| 0.9097222222222222 | 0 |
| 0.9104166666666668 | 0 |
| 0.9111111111111111 | 0 |
| 0.9118055555555555 | 0 |
| 0.9125 | 0 |
| 0.9131944444444445 | 0 |
| 0.9138888888888889 | 0 |
| 0.9145833333333333 | 0 |
| 0.9152777777777777 | 0 |
| 0.9159722222222223 | 0 |
| 0.9166666666666666 | 0 |
| 0.9173611111111111 | 0 |
| 0.9180555555555556 | 0 |
| 0.9187500000000001 | 0 |
| 0.9194444444444444 | 0 |
| 0.9201388888888888 | 0 |
| 0.9208333333333334 | 0 |
| 0.9215277777777778 | 0 |
| 0.9222222222222222 | 0 |
| 0.9229166666666666 | 0 |
| 0.9236111111111112 | 0 |
| 0.9243055555555556 | 0 |
| 0.9249999999999999 | 0 |
| 0.9256944444444444 | 0 |
| 0.9263888888888889 | 0 |
| 0.9270833333333334 | 0 |
| 0.9277777777777777 | 0 |
| 0.9284722222222223 | 0 |
| 0.9291666666666667 | 0 |
| 0.9298611111111111 | 0 |
| 0.9305555555555555 | 0 |
| 0.93125 | 0 |
| 0.9319444444444445 | 0 |
| 0.9326388888888889 | 0 |
| 0.9333333333333332 | 0 |
| 0.9340277777777778 | 0 |
| 0.9347222222222222 | 0 |
| 0.9354166666666667 | 0 |
| 0.936111111111111 | 0 |
| 0.9368055555555556 | 0 |
| 0.9375 | 0 |
| 0.9381944444444444 | 0 |
| 0.938888888888889 | 0 |
| 0.9395833333333333 | 0 |
| 0.9402777777777778 | 0 |
| 0.9409722222222222 | 0 |
| 0.9416666666666668 | 0 |
| 0.9423611111111111 | 0 |
| 0.9430555555555555 | 0 |
| 0.94375 | 0 |
| 0.9444444444444445 | 0 |
| 0.9451388888888889 | 0 |
| 0.9458333333333333 | 0 |
| 0.9465277777777777 | 0 |
| 0.9472222222222223 | 0 |
| 0.9479166666666666 | 0 |
| 0.9486111111111111 | 0 |
| 0.9493055555555556 | 0 |
| 0.9500000000000001 | 0 |
| 0.9506944444444444 | 0 |
| 0.9513888888888888 | 0 |
| 0.9520833333333334 | 0 |
| 0.9527777777777778 | 0 |
| 0.9534722222222222 | 0 |
| 0.9541666666666666 | 0 |
| 0.9548611111111112 | 0 |
| 0.9555555555555556 | 0 |
| 0.9562499999999999 | 0 |
| 0.9569444444444444 | 0 |
| 0.9576388888888889 | 0 |
| 0.9583333333333334 | 0 |
| 0.9590277777777777 | 0 |
| 0.9597222222222223 | 0 |
| 0.9604166666666667 | 0 |
| 0.9611111111111111 | 0 |
| 0.9618055555555555 | 0 |
| 0.9625 | 0 |
| 0.9631944444444445 | 0 |
| 0.9638888888888889 | 0 |
| 0.9645833333333332 | 0 |
| 0.9652777777777778 | 0 |
| 0.9659722222222222 | 0 |
| 0.9666666666666667 | 0 |
| 0.967361111111111 | 0 |
| 0.9680555555555556 | 0 |
| 0.96875 | 0 |
| 0.9694444444444444 | 0 |
| 0.970138888888889 | 0 |
| 0.9708333333333333 | 0 |
| 0.9715277777777778 | 0 |
| 0.9722222222222222 | 0 |
| 0.9729166666666668 | 0 |
| 0.9736111111111111 | 0 |
| 0.9743055555555555 | 0 |
| 0.975 | 0 |
| 0.9756944444444445 | 0 |
| 0.9763888888888889 | 0 |
| 0.9770833333333333 | 0 |
| 0.9777777777777777 | 0 |
| 0.9784722222222223 | 0 |
| 0.9791666666666666 | 0 |
| 0.9798611111111111 | 0 |
| 0.9805555555555556 | 0 |
| 0.9812500000000001 | 0 |
| 0.9819444444444444 | 0 |
| 0.9826388888888888 | 0 |
| 0.9833333333333334 | 0 |
| 0.9840277777777778 | 0 |
| 0.9847222222222222 | 0 |
| 0.9854166666666666 | 0 |
| 0.9861111111111112 | 0 |
| 0.9868055555555556 | 0 |
| 0.9874999999999999 | 0 |
| 0.9881944444444444 | 0 |
| 0.9888888888888889 | 0 |
| 0.9895833333333334 | 0 |
| 0.9902777777777777 | 0 |
| 0.9909722222222223 | 0 |
| 0.9916666666666667 | 0 |
| 0.9923611111111111 | 0 |
| 0.9930555555555555 | 0 |
| 0.99375 | 0 |
| 0.9944444444444445 | 0 |
| 0.9951388888888889 | 0 |
| 0.9958333333333332 | 0 |
| 0.9965277777777778 | 0 |
| 0.9972222222222222 | 0 |
| 0.9979166666666667 | 0 |
| 0.998611111111111 | 0 |
| 0.9993055555555556 | 0 |